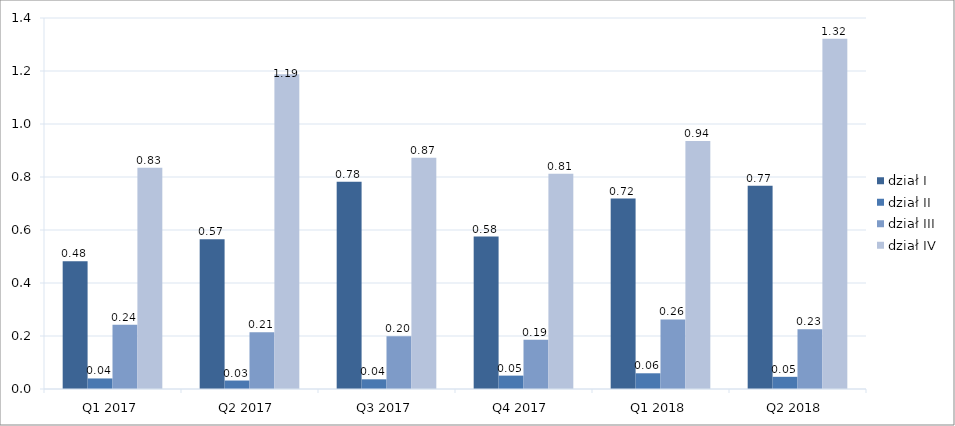
| Category | dział I | dział II | dział III | dział IV |
|---|---|---|---|---|
| Q1 2017 | 482512 | 39779 | 242322 | 834979 |
| Q2 2017 | 565322 | 31974 | 214418 | 1188184 |
| Q3 2017 | 781733 | 36541 | 198657 | 872636 |
| Q4 2017 | 575281 | 50483 | 185493 | 811827 |
| Q1 2018 | 718475 | 59297 | 262371 | 935965 |
| Q2 2018 | 767224 | 45941 | 225020 | 1321477 |